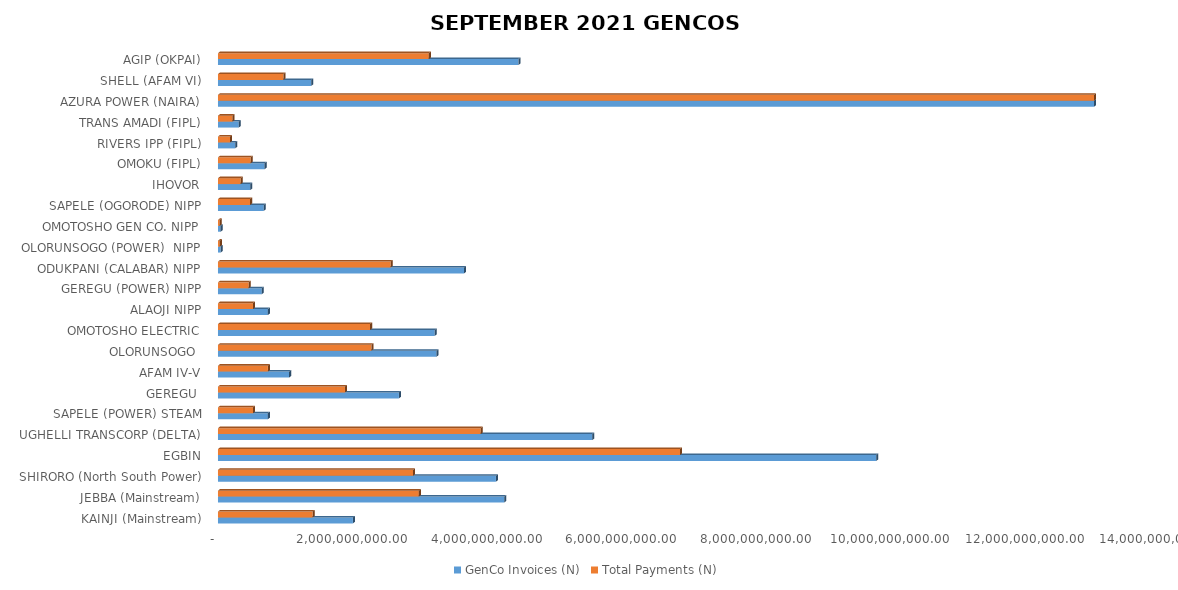
| Category | GenCo Invoices (N) | Total Payments (N) |
|---|---|---|
| KAINJI (Mainstream) | 2006475297.83 | 1408312833.628 |
| JEBBA (Mainstream) | 4255928923.39 | 2987168258.838 |
| SHIRORO (North South Power) | 4133295234.96 | 2901093639.61 |
| EGBIN | 9790252566.34 | 6871621269.671 |
| UGHELLI TRANSCORP (DELTA) | 5566868060.81 | 3907295415.813 |
| SAPELE (POWER) STEAM | 741928608.42 | 520747791.913 |
| GEREGU  | 2690603308.47 | 1888491312.91 |
| AFAM IV-V | 1057526439.54 | 742260848.322 |
| OLORUNSOGO  | 3250593153.69 | 2281539204.692 |
| OMOTOSHO ELECTRIC | 3223129897.4 | 2262263185.531 |
| ALAOJI NIPP | 741532315.99 | 520469640.612 |
| GEREGU (POWER) NIPP | 651240052.47 | 457094948.868 |
| ODUKPANI (CALABAR) NIPP | 3659232647.07 | 2568356711.729 |
| OLORUNSOGO (POWER)  NIPP | 39989518.52 | 28068001.736 |
| OMOTOSHO GEN CO. NIPP | 39035308.74 | 27398257.194 |
| SAPELE (OGORODE) NIPP | 680697972.13 | 477770990.259 |
| IHOVOR | 480821788.85 | 337481102.637 |
| OMOKU (FIPL) | 693107592.16 | 486481103.545 |
| RIVERS IPP (FIPL) | 255298765.11 | 179190108.995 |
| TRANS AMADI (FIPL) | 309043476.61 | 216912660.091 |
| AZURA POWER (NAIRA) | 13027327597.278 | 13027327597.278 |
| SHELL (AFAM VI) | 1386896332.598 | 973440294.143 |
| AGIP (OKPAI) | 4467531449.544 | 3135688678.468 |